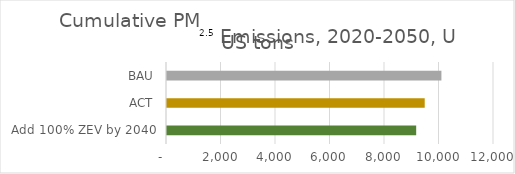
| Category | Cumulative PM2.5 Emissions, 2020-2050, US tons |
|---|---|
| Add 100% ZEV by 2040 | 9144.226 |
| ACT | 9457 |
| BAU | 10070 |